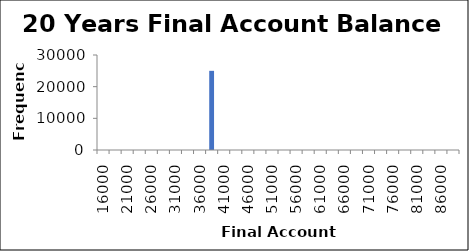
| Category | Frequency |
|---|---|
| 16000.0 | 0 |
| 18500.0 | 0 |
| 21000.0 | 0 |
| 23500.0 | 0 |
| 26000.0 | 0 |
| 28500.0 | 0 |
| 31000.0 | 0 |
| 33500.0 | 0 |
| 36000.0 | 0 |
| 38500.0 | 25000 |
| 41000.0 | 0 |
| 43500.0 | 0 |
| 46000.0 | 0 |
| 48500.0 | 0 |
| 51000.0 | 0 |
| 53500.0 | 0 |
| 56000.0 | 0 |
| 58500.0 | 0 |
| 61000.0 | 0 |
| 63500.0 | 0 |
| 66000.0 | 0 |
| 68500.0 | 0 |
| 71000.0 | 0 |
| 73500.0 | 0 |
| 76000.0 | 0 |
| 78500.0 | 0 |
| 81000.0 | 0 |
| 83500.0 | 0 |
| 86000.0 | 0 |
| More | 0 |